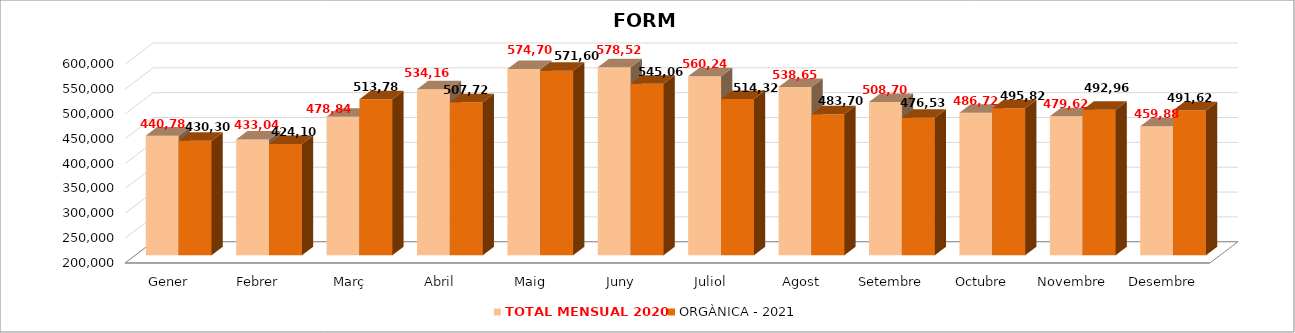
| Category | TOTAL MENSUAL 2020 | ORGÀNICA - 2021 |
|---|---|---|
| Gener | 440780.04 | 430300 |
| Febrer | 433039.99 | 424100 |
| Març | 478840 | 513779.99 |
| Abril | 534160 | 507720 |
| Maig | 574700 | 571600.01 |
| Juny | 578520 | 545060 |
| Juliol | 560240.01 | 514319.99 |
| Agost | 538654 | 483699.99 |
| Setembre | 508699.99 | 476530 |
| Octubre | 486720 | 495820 |
| Novembre | 479620 | 492960 |
| Desembre | 459880 | 491620 |